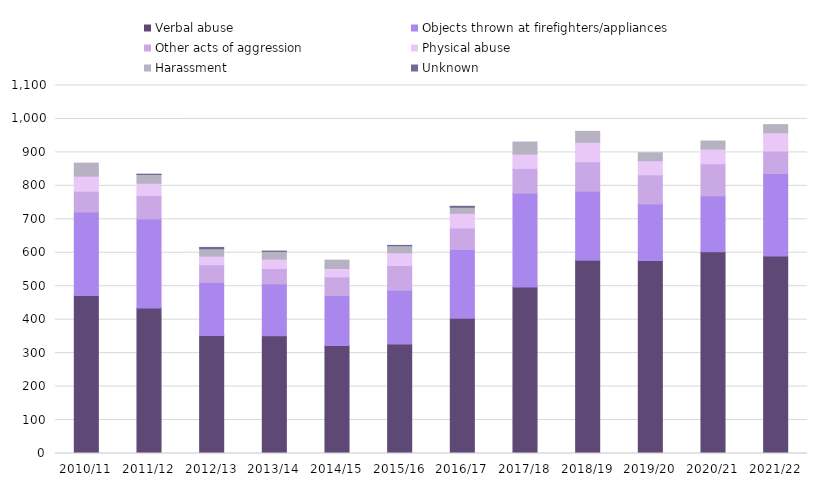
| Category | Verbal abuse | Objects thrown at firefighters/appliances | Other acts of aggression | Physical abuse | Harassment | Unknown |
|---|---|---|---|---|---|---|
| 2010/11 | 472 | 250 | 62 | 45 | 39 | 0 |
| 2011/12 | 435 | 266 | 70 | 37 | 26 | 1 |
| 2012/13 | 353 | 158 | 53 | 26 | 22 | 4 |
| 2013/14 | 352 | 155 | 46 | 28 | 23 | 1 |
| 2014/15 | 323 | 149 | 56 | 25 | 25 | 0 |
| 2015/16 | 327 | 161 | 74 | 38 | 21 | 1 |
| 2016/17 | 404 | 206 | 64 | 44 | 18 | 3 |
| 2017/18 | 498 | 280 | 74 | 43 | 36 | 0 |
| 2018/19 | 578 | 206 | 88 | 58 | 33 | 0 |
| 2019/20 | 577 | 169 | 87 | 42 | 24 | 0 |
| 2020/21 | 603 | 167 | 96 | 44 | 24 | 0 |
| 2021/22 | 590 | 247 | 67 | 55 | 24 | 0 |